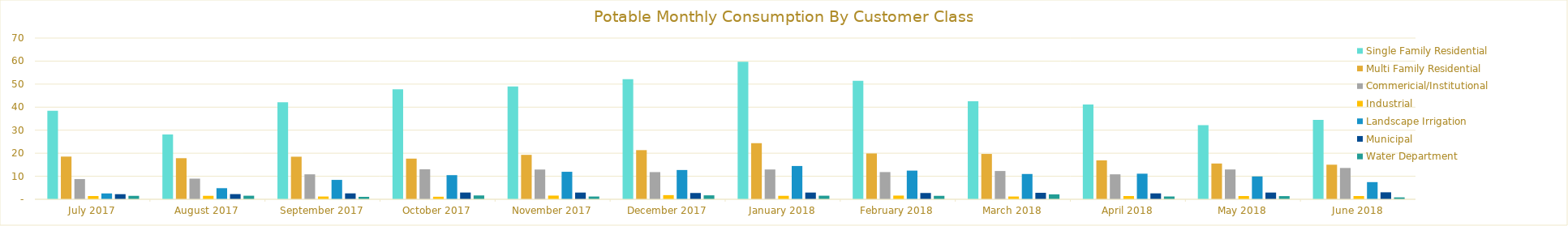
| Category | Single Family Residential | Multi Family Residential | Commericial/Institutional | Industrial | Landscape Irrigation | Municipal | Water Department |
|---|---|---|---|---|---|---|---|
| 2017-07-01 | 38.42 | 18.536 | 8.778 | 1.4 | 2.54 | 2.215 | 1.495 |
| 2017-08-01 | 28.18 | 17.836 | 8.962 | 1.5 | 4.82 | 2.246 | 1.546 |
| 2017-09-01 | 42.15 | 18.487 | 10.836 | 1.2 | 8.42 | 2.563 | 1.05 |
| 2017-10-01 | 47.77 | 17.654 | 13.006 | 1.1 | 10.48 | 2.931 | 1.663 |
| 2017-11-01 | 48.99 | 19.285 | 12.912 | 1.6 | 11.94 | 2.915 | 1.201 |
| 2017-12-01 | 52.18 | 21.336 | 11.798 | 1.8 | 12.71 | 2.726 | 1.714 |
| 2018-01-01 | 59.73 | 24.367 | 12.936 | 1.5 | 14.45 | 2.919 | 1.554 |
| 2018-02-01 | 51.48 | 19.894 | 11.814 | 1.6 | 12.45 | 2.729 | 1.495 |
| 2018-03-01 | 42.54 | 19.684 | 12.278 | 1.2 | 10.98 | 2.807 | 2.134 |
| 2018-04-01 | 41.15 | 16.898 | 10.836 | 1.4 | 11.11 | 2.563 | 1.218 |
| 2018-05-01 | 32.15 | 15.526 | 12.939 | 1.4 | 9.92 | 2.919 | 1.378 |
| 2018-06-01 | 34.45 | 15.015 | 13.594 | 1.4 | 7.45 | 3.03 | 0.823 |